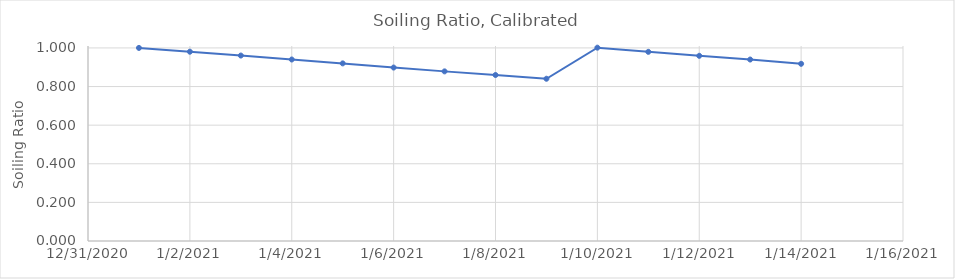
| Category | Soiling Ratio, Calibrated |
|---|---|
| 44197.0 | 1 |
| 44198.0 | 0.98 |
| 44199.0 | 0.961 |
| 44200.0 | 0.94 |
| 44201.0 | 0.92 |
| 44202.0 | 0.898 |
| 44203.0 | 0.879 |
| 44204.0 | 0.86 |
| 44205.0 | 0.84 |
| 44206.0 | 1.001 |
| 44207.0 | 0.98 |
| 44208.0 | 0.959 |
| 44209.0 | 0.94 |
| 44210.0 | 0.918 |